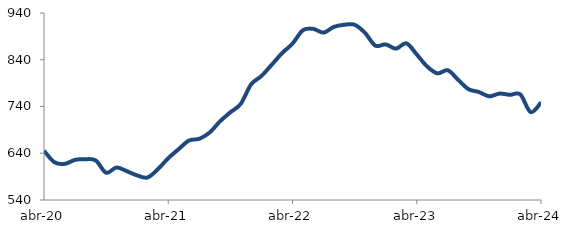
| Category | Series 0 |
|---|---|
| 2020-04-01 | 645.351 |
| 2020-05-01 | 620.935 |
| 2020-06-01 | 617.256 |
| 2020-07-01 | 625.855 |
| 2020-08-01 | 627.288 |
| 2020-09-01 | 624.542 |
| 2020-10-01 | 598.351 |
| 2020-11-01 | 609.465 |
| 2020-12-01 | 601.605 |
| 2021-01-01 | 592.504 |
| 2021-02-01 | 588.185 |
| 2021-03-01 | 605.989 |
| 2021-04-01 | 629.446 |
| 2021-05-01 | 648.73 |
| 2021-06-01 | 667.177 |
| 2021-07-01 | 670.996 |
| 2021-08-01 | 684.389 |
| 2021-09-01 | 708.308 |
| 2021-10-01 | 727.608 |
| 2021-11-01 | 745.65 |
| 2021-12-01 | 787.184 |
| 2022-01-01 | 805.308 |
| 2022-02-01 | 829.502 |
| 2022-03-01 | 854.336 |
| 2022-04-01 | 874.453 |
| 2022-05-01 | 903.049 |
| 2022-06-01 | 906.022 |
| 2022-07-01 | 898.071 |
| 2022-08-01 | 910.353 |
| 2022-09-01 | 914.859 |
| 2022-10-01 | 914.857 |
| 2022-11-01 | 897.607 |
| 2022-12-01 | 870.196 |
| 2023-01-01 | 872.784 |
| 2023-02-01 | 863.736 |
| 2023-03-01 | 875.118 |
| 2023-04-01 | 851.276 |
| 2023-05-01 | 825.667 |
| 2023-06-01 | 810.924 |
| 2023-07-01 | 817.469 |
| 2023-08-01 | 797.001 |
| 2023-09-01 | 777.024 |
| 2023-10-01 | 770.975 |
| 2023-11-01 | 761.798 |
| 2023-12-01 | 767.626 |
| 2024-01-01 | 764.98 |
| 2024-02-01 | 765.887 |
| 2024-03-01 | 728.107 |
| 2024-04-01 | 748.595 |